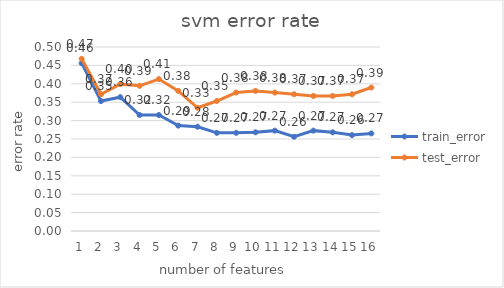
| Category | train_error | test_error |
|---|---|---|
| 1.0 | 0.456 | 0.468 |
| 2.0 | 0.353 | 0.372 |
| 3.0 | 0.364 | 0.399 |
| 4.0 | 0.315 | 0.394 |
| 5.0 | 0.315 | 0.413 |
| 6.0 | 0.286 | 0.381 |
| 7.0 | 0.283 | 0.335 |
| 8.0 | 0.267 | 0.353 |
| 9.0 | 0.267 | 0.376 |
| 10.0 | 0.268 | 0.381 |
| 11.0 | 0.273 | 0.376 |
| 12.0 | 0.256 | 0.372 |
| 13.0 | 0.273 | 0.367 |
| 14.0 | 0.268 | 0.367 |
| 15.0 | 0.261 | 0.372 |
| 16.0 | 0.265 | 0.39 |